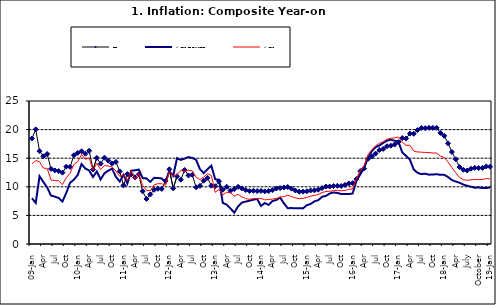
| Category | Food | All Items less Farm Produce | All Items |
|---|---|---|---|
| 09-Jan | 18.436 | 8.013 | 14.034 |
| Feb | 20.041 | 7.178 | 14.584 |
| Mar | 16.233 | 11.842 | 14.366 |
| Apr | 15.342 | 10.85 | 13.268 |
| May | 15.74 | 9.88 | 13.212 |
| June | 13.138 | 8.472 | 11.194 |
| Jul | 12.867 | 8.285 | 11.09 |
| Aug | 12.746 | 8.044 | 11.046 |
| Sep | 12.472 | 7.431 | 10.39 |
| Oct | 13.524 | 8.933 | 11.588 |
| Nov | 13.482 | 10.702 | 12.368 |
| Dec | 15.518 | 11.249 | 13.93 |
| 10-Jan | 15.918 | 12.063 | 14.398 |
| Feb | 16.208 | 13.978 | 15.649 |
| Mar | 15.79 | 13.184 | 14.812 |
| Apr | 16.306 | 12.844 | 15.044 |
| May | 13.023 | 11.711 | 12.915 |
| Jun | 15.053 | 12.686 | 14.099 |
| Jul | 14.043 | 11.287 | 13.002 |
| Aug | 15.09 | 12.366 | 13.702 |
| Sep | 14.57 | 12.83 | 13.65 |
| Oct | 14.065 | 13.168 | 13.45 |
| Nov | 14.351 | 11.746 | 12.766 |
| Dec | 12.701 | 10.917 | 11.815 |
| 11-Jan | 10.255 | 12.118 | 12.08 |
| Feb | 12.221 | 10.569 | 11.1 |
| Mar | 12.169 | 12.815 | 12.779 |
| Apr | 11.629 | 12.882 | 11.291 |
| May | 12.179 | 13.006 | 12.352 |
| Jun | 9.22 | 11.524 | 10.23 |
| Jul | 7.877 | 11.472 | 9.397 |
| Aug | 8.665 | 10.863 | 9.301 |
| Sep | 9.479 | 11.567 | 10.339 |
| Oct | 9.656 | 11.539 | 10.544 |
| Nov | 9.623 | 11.459 | 10.54 |
| Dec | 11.02 | 10.822 | 10.283 |
| 12-Jan | 13.053 | 12.748 | 12.626 |
| 12-Feb | 9.729 | 11.901 | 11.866 |
| 12-Mar | 11.848 | 14.995 | 12.111 |
| Apr | 11.246 | 14.703 | 12.866 |
| May | 12.942 | 14.926 | 12.688 |
| Jun | 11.991 | 15.199 | 12.892 |
| Jul | 12.093 | 15.045 | 12.797 |
| Aug | 9.91 | 14.714 | 11.689 |
| Sep | 10.164 | 13.101 | 11.253 |
| Oct | 11.064 | 12.398 | 11.693 |
| Nov | 11.553 | 13.092 | 12.32 |
| Dec | 10.199 | 13.685 | 11.981 |
| 13-Jan | 10.106 | 11.342 | 9.031 |
| Feb | 10.973 | 11.184 | 9.542 |
| Mar | 9.482 | 7.179 | 8.593 |
| Apr | 10.006 | 6.874 | 9.052 |
| May | 9.321 | 6.227 | 8.964 |
| Jun | 9.606 | 5.472 | 8.353 |
| Jul | 9.994 | 6.58 | 8.682 |
| Aug | 9.723 | 7.245 | 8.231 |
| Sep | 9.437 | 7.41 | 7.952 |
| Oct | 9.249 | 7.579 | 7.807 |
| Nov | 9.313 | 7.75 | 7.931 |
| Dec | 9.253 | 7.872 | 7.957 |
| 14-Jan | 9.271 | 6.648 | 7.977 |
| Feb | 9.207 | 7.166 | 7.707 |
| Mar | 9.254 | 6.836 | 7.783 |
| Apr | 9.414 | 7.508 | 7.851 |
| May | 9.698 | 7.693 | 7.965 |
| Jun | 9.776 | 8.122 | 8.167 |
| Jul | 9.878 | 7.116 | 8.281 |
| Aug | 9.959 | 6.264 | 8.534 |
| Sep | 9.676 | 6.278 | 8.317 |
| Oct | 9.343 | 6.252 | 8.06 |
| Nov | 9.144 | 6.255 | 7.927 |
| Dec | 9.152 | 6.225 | 7.978 |
| 15-Jan | 9.215 | 6.787 | 8.157 |
| Feb | 9.359 | 6.994 | 8.359 |
| Mar | 9.376 | 7.46 | 8.494 |
| Apr | 9.49 | 7.661 | 8.655 |
| May | 9.782 | 8.253 | 9.003 |
| Jun | 10.041 | 8.403 | 9.168 |
| Jul | 10.049 | 8.83 | 9.218 |
| Aug | 10.131 | 9.01 | 9.336 |
| Sep | 10.174 | 8.928 | 9.394 |
| Oct | 10.129 | 8.742 | 9.296 |
| Nov | 10.321 | 8.732 | 9.368 |
| Dec | 10.588 | 8.727 | 9.554 |
| 16-Jan | 10.642 | 8.841 | 9.617 |
| Feb | 11.348 | 11.041 | 11.379 |
| Mar | 12.745 | 12.17 | 12.775 |
| Apr | 13.194 | 13.352 | 13.721 |
| May | 14.861 | 15.054 | 15.577 |
| Jun | 15.302 | 16.224 | 16.48 |
| Jul | 15.799 | 16.929 | 17.127 |
| Aug | 16.427 | 17.208 | 17.609 |
| Sep | 16.622 | 17.666 | 17.852 |
| Oct | 17.09 | 18.067 | 18.33 |
| Nov | 17.191 | 18.241 | 18.476 |
| Dec | 17.388 | 18.052 | 18.547 |
| 17-Jan | 17.818 | 17.867 | 18.719 |
| Feb | 18.528 | 16.011 | 17.78 |
| Mar | 18.436 | 15.404 | 17.256 |
| Apr | 19.303 | 14.75 | 17.244 |
| May | 19.266 | 13.016 | 16.251 |
| Jun | 19.915 | 12.455 | 16.098 |
| Jul | 20.284 | 12.207 | 16.053 |
| Aug | 20.251 | 12.296 | 16.012 |
| Sep | 20.321 | 12.123 | 15.979 |
| Oct | 20.306 | 12.142 | 15.905 |
| Nov | 20.308 | 12.206 | 15.901 |
| Dec | 19.415 | 12.089 | 15.372 |
| 18-Jan | 18.919 | 12.09 | 15.127 |
| Feb | 17.588 | 11.707 | 14.33 |
| Mar | 16.08 | 11.181 | 13.337 |
| Apr | 14.799 | 10.92 | 12.482 |
| May | 13.448 | 10.71 | 11.608 |
| June | 12.977 | 10.387 | 11.231 |
| July | 12.85 | 10.183 | 11.142 |
| August | 13.158 | 10.015 | 11.227 |
| September | 13.309 | 9.838 | 11.284 |
| October | 13.277 | 9.882 | 11.259 |
| November | 13.301 | 9.787 | 11.281 |
| December | 13.559 | 9.771 | 11.442 |
| 19-Jan | 13.505 | 9.91 | 11.374 |